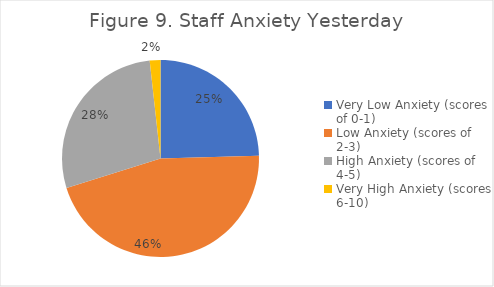
| Category | Series 0 |
|---|---|
| Very Low Anxiety (scores of 0-1) | 0.246 |
| Low Anxiety (scores of 2-3) | 0.456 |
| High Anxiety (scores of 4-5) | 0.281 |
| Very High Anxiety (scores 6-10) | 0.018 |